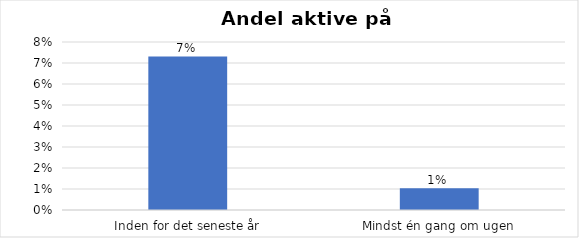
| Category | % |
|---|---|
| Inden for det seneste år | 0.073 |
| Mindst én gang om ugen | 0.01 |